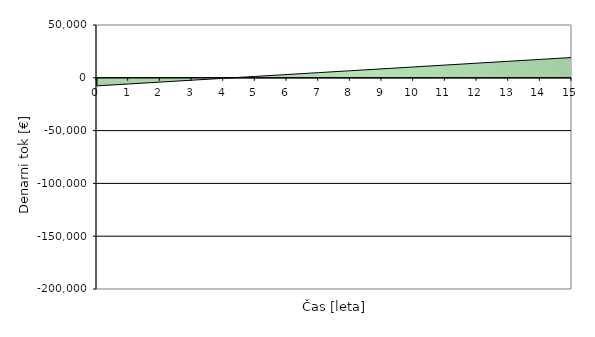
| Category | Series 0 |
|---|---|
| 0.0 | -7650 |
| 1.0 | -5857.794 |
| 2.0 | -4065.589 |
| 3.0 | -2273.383 |
| 4.0 | -481.178 |
| 5.0 | 1311.028 |
| 6.0 | 3103.233 |
| 7.0 | 4895.439 |
| 8.0 | 6687.644 |
| 9.0 | 8479.85 |
| 10.0 | 10272.055 |
| 11.0 | 12064.261 |
| 12.0 | 13856.466 |
| 13.0 | 15648.672 |
| 14.0 | 17440.877 |
| 15.0 | 19233.083 |